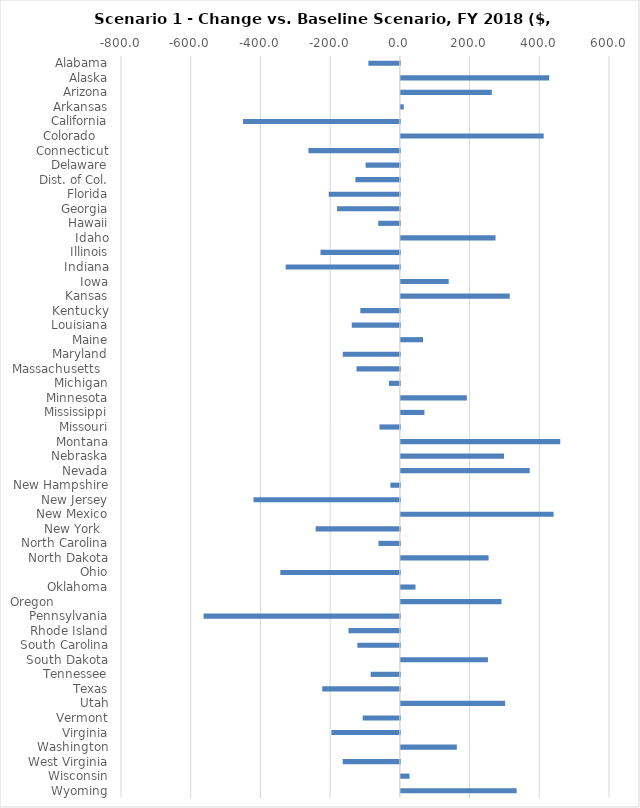
| Category | #REF! |
|---|---|
| Alabama | -90.308 |
| Alaska | 425.617 |
| Arizona | 261.014 |
| Arkansas | 8.49 |
| California | -449.855 |
| Colorado    | 409.722 |
| Connecticut | -262.306 |
| Delaware | -98.215 |
| Dist. of Col. | -127.593 |
| Florida | -204.014 |
| Georgia | -180.123 |
| Hawaii | -62.039 |
| Idaho | 271.66 |
| Illinois | -227.609 |
| Indiana | -327.581 |
| Iowa | 137.268 |
| Kansas | 312.402 |
| Kentucky | -113.308 |
| Louisiana | -137.966 |
| Maine | 63.553 |
| Maryland | -163.888 |
| Massachusetts   | -124.255 |
| Michigan | -31.154 |
| Minnesota | 189.267 |
| Mississippi | 67.702 |
| Missouri | -58.436 |
| Montana | 457.318 |
| Nebraska | 295.939 |
| Nevada | 369.645 |
| New Hampshire | -27.215 |
| New Jersey | -419.985 |
| New Mexico | 438.258 |
| New York   | -241.621 |
| North Carolina | -61.463 |
| North Dakota | 251.72 |
| Ohio | -342.937 |
| Oklahoma | 41.957 |
| Oregon               | 288.844 |
| Pennsylvania | -563.229 |
| Rhode Island | -147.227 |
| South Carolina | -121.764 |
| South Dakota | 249.818 |
| Tennessee | -83.684 |
| Texas | -222.601 |
| Utah | 299.315 |
| Vermont | -106.614 |
| Virginia | -196.333 |
| Washington | 160.538 |
| West Virginia | -163.911 |
| Wisconsin | 24.905 |
| Wyoming | 332.262 |